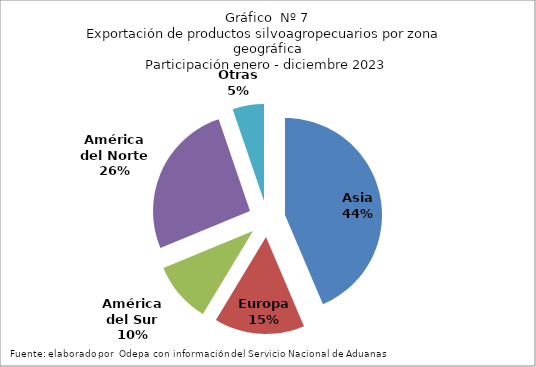
| Category | Series 0 |
|---|---|
| Asia | 7627303.356 |
| Europa | 2629983.973 |
| América del Sur | 1772526.319 |
| América del Norte | 4546930.662 |
| Otras | 916036.69 |